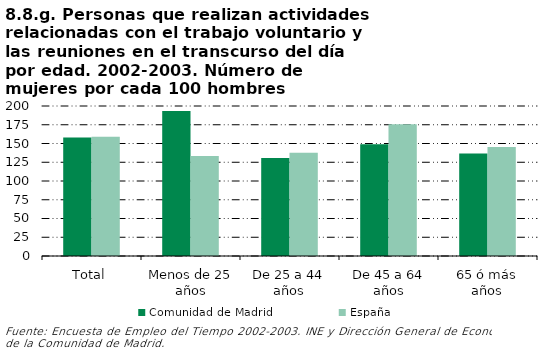
| Category | Comunidad de Madrid | España |
|---|---|---|
| Total | 158.025 | 158.947 |
| Menos de 25 años | 193.333 | 133.333 |
| De 25 a 44 años | 130.612 | 137.681 |
| De 45 a 64 años | 148.98 | 175.652 |
| 65 ó más años | 136.816 | 145.251 |